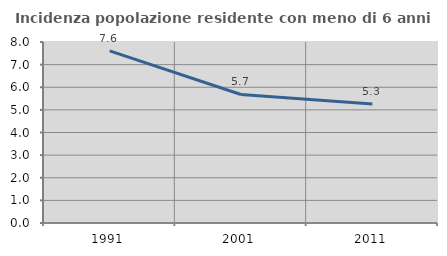
| Category | Incidenza popolazione residente con meno di 6 anni |
|---|---|
| 1991.0 | 7.608 |
| 2001.0 | 5.681 |
| 2011.0 | 5.259 |